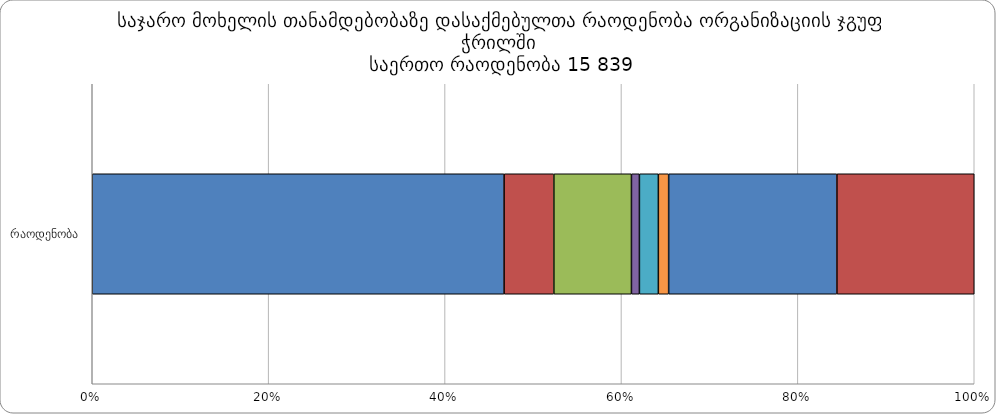
| Category |  ადგილობრივი თვითმმართველობის ორგანოები |  აჭარისა და აფხაზეთის ავტონომიური რესპუბლიკ |  სასამართლოები |  საქართველოს მთავრობისა და პრეზიდენტის ადმი |  საქართველოს პარლამენტი |  სახელმწიფო რწმუნებულების – გუბერნატორების |  სხვა საჯარო დაწესებულებები |  სამინისტროები და სახელმწიფო მინისტრების აპარატები შსს გარეშე |
|---|---|---|---|---|---|---|---|---|
| რაოდენობა | 7396 | 894 | 1393 | 143 | 340 | 185 | 3022 | 2466 |